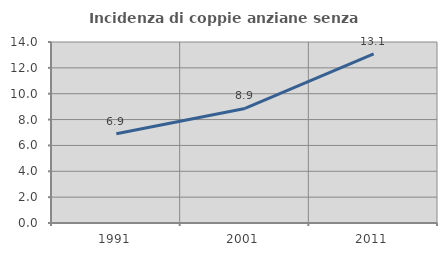
| Category | Incidenza di coppie anziane senza figli  |
|---|---|
| 1991.0 | 6.908 |
| 2001.0 | 8.861 |
| 2011.0 | 13.087 |